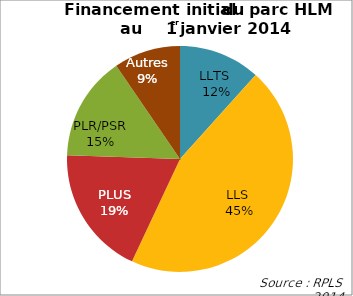
| Category | Series 0 |
|---|---|
| LLTS  | 0.117 |
| LLS  | 0.453 |
| PLUS | 0.186 |
| PLR/PSR | 0.149 |
| Autres | 0.095 |